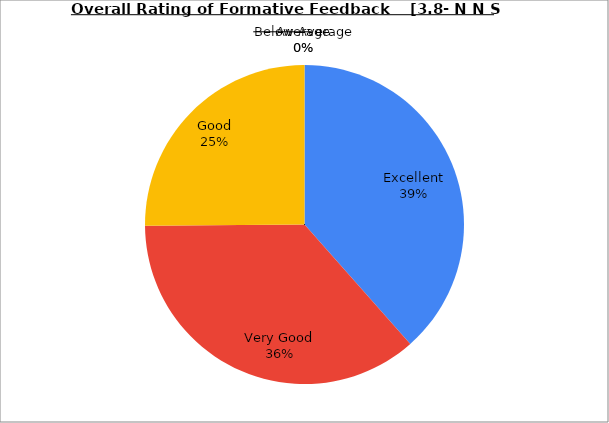
| Category | Series 0 |
|---|---|
| Excellent | 38.462 |
| Very Good | 36.41 |
| Good | 25.128 |
| Average | 0 |
| Below Average | 0 |